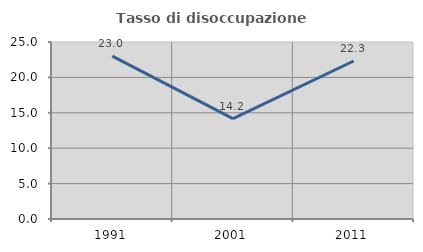
| Category | Tasso di disoccupazione giovanile  |
|---|---|
| 1991.0 | 22.995 |
| 2001.0 | 14.167 |
| 2011.0 | 22.314 |